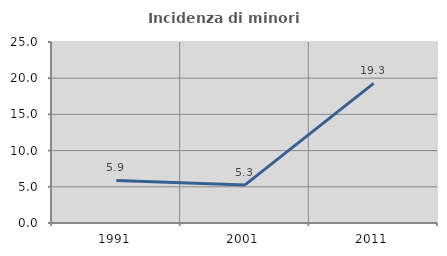
| Category | Incidenza di minori stranieri |
|---|---|
| 1991.0 | 5.882 |
| 2001.0 | 5.263 |
| 2011.0 | 19.277 |